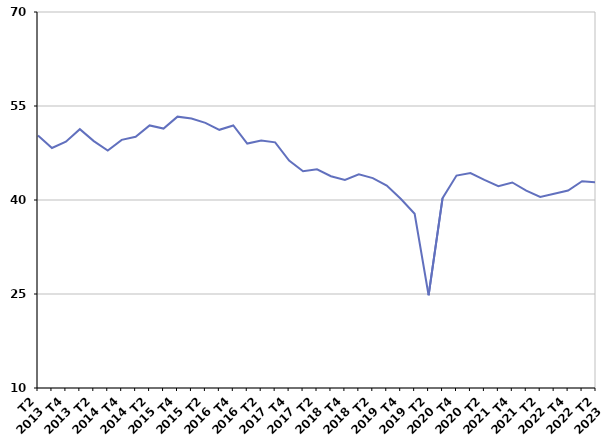
| Category | Autre cas |
|---|---|
| T2
2013 | 50.3 |
| T3
2013 | 48.3 |
| T4
2013 | 49.3 |
| T1
2014 | 51.3 |
| T2
2014 | 49.4 |
| T3
2014 | 47.9 |
| T4
2014 | 49.6 |
| T1
2015 | 50.1 |
| T2
2015 | 51.9 |
| T3
2015 | 51.4 |
| T4
2015 | 53.3 |
| T1
2016 | 53 |
| T2
2016 | 52.3 |
| T3
2016 | 51.2 |
| T4
2016 | 51.9 |
| T1
2017 | 49 |
| T2
2017 | 49.5 |
| T3
2017 | 49.2 |
| T4
2017 | 46.3 |
| T1
2018 | 44.6 |
| T2
2018 | 44.9 |
| T3
2018 | 43.8 |
| T4
2018 | 43.2 |
| T1
2019 | 44.1 |
| T2
2019 | 43.5 |
| T3
2019 | 42.3 |
| T4
2019 | 40.2 |
| T1
2020 | 37.8 |
| T2
2020 | 24.8 |
| T3
2020 | 40.3 |
| T4
2020 | 43.9 |
| T1
2021 | 44.3 |
| T2
2021 | 43.2 |
| T3
2021 | 42.2 |
| T4
2021 | 42.8 |
| T1
2022 | 41.5 |
| T2
2022 | 40.5 |
| T3
2022 | 41 |
| T4
2022 | 41.5 |
| T1
2023 | 43 |
| T2
2023 | 42.8 |